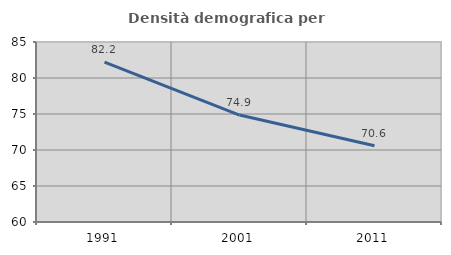
| Category | Densità demografica |
|---|---|
| 1991.0 | 82.195 |
| 2001.0 | 74.851 |
| 2011.0 | 70.579 |